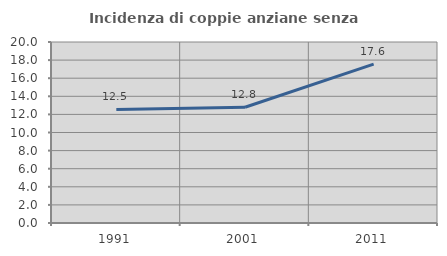
| Category | Incidenza di coppie anziane senza figli  |
|---|---|
| 1991.0 | 12.549 |
| 2001.0 | 12.791 |
| 2011.0 | 17.557 |